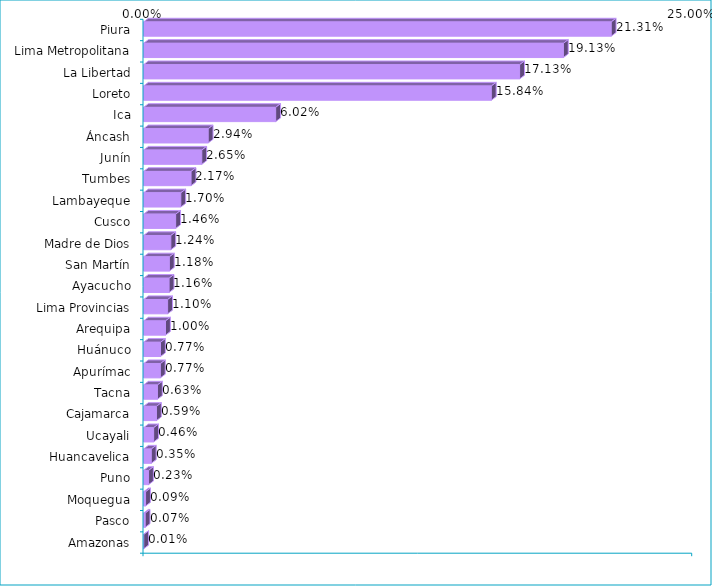
| Category | Series 0 |
|---|---|
| Piura | 0.213 |
| Lima Metropolitana | 0.191 |
| La Libertad | 0.171 |
| Loreto | 0.158 |
| Ica | 0.06 |
| Áncash | 0.029 |
| Junín | 0.027 |
| Tumbes | 0.022 |
| Lambayeque | 0.017 |
| Cusco | 0.015 |
| Madre de Dios | 0.012 |
| San Martín | 0.012 |
| Ayacucho | 0.012 |
| Lima Provincias | 0.011 |
| Arequipa | 0.01 |
| Huánuco | 0.008 |
| Apurímac | 0.008 |
| Tacna | 0.006 |
| Cajamarca | 0.006 |
| Ucayali | 0.005 |
| Huancavelica | 0.004 |
| Puno | 0.002 |
| Moquegua | 0.001 |
| Pasco | 0.001 |
| Amazonas | 0 |